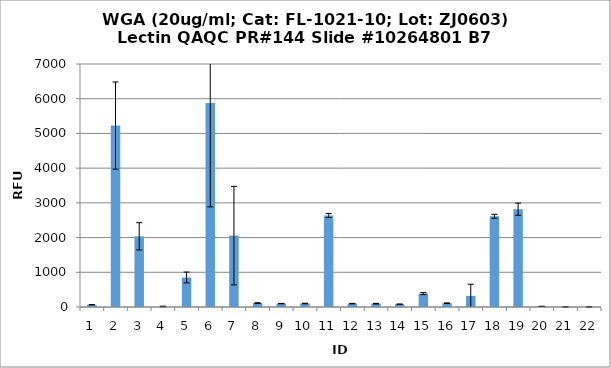
| Category | Series 0 |
|---|---|
| 0 | 65.75 |
| 1 | 5227 |
| 2 | 2035.75 |
| 3 | 14.25 |
| 4 | 850.25 |
| 5 | 5878.5 |
| 6 | 2055.75 |
| 7 | 113.5 |
| 8 | 98.75 |
| 9 | 100.25 |
| 10 | 2636.75 |
| 11 | 97.75 |
| 12 | 95.25 |
| 13 | 80.75 |
| 14 | 386.75 |
| 15 | 109.5 |
| 16 | 321 |
| 17 | 2614 |
| 18 | 2818.25 |
| 19 | 17.75 |
| 20 | 2 |
| 21 | 1.75 |